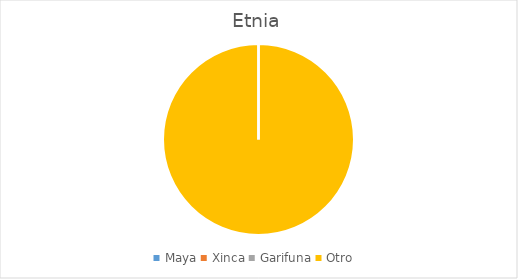
| Category | Series 0 |
|---|---|
| Maya | 0 |
| Xinca | 0 |
| Garifuna | 0 |
| Otro | 88 |